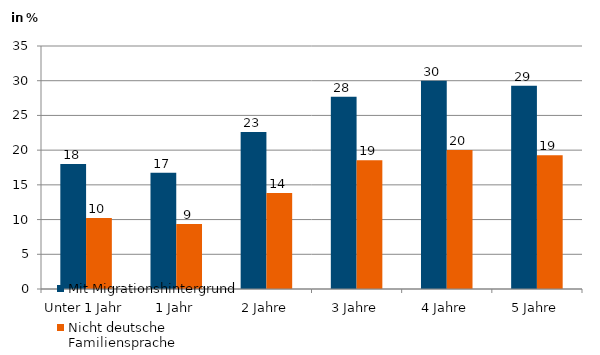
| Category | Mit Migrationshintergrund | Nicht deutsche Familiensprache |
|---|---|---|
| Unter 1 Jahr | 17.999 | 10.242 |
| 1 Jahr | 16.73 | 9.373 |
| 2 Jahre | 22.61 | 13.816 |
| 3 Jahre | 27.679 | 18.535 |
| 4 Jahre | 29.985 | 20.025 |
| 5 Jahre | 29.282 | 19.252 |